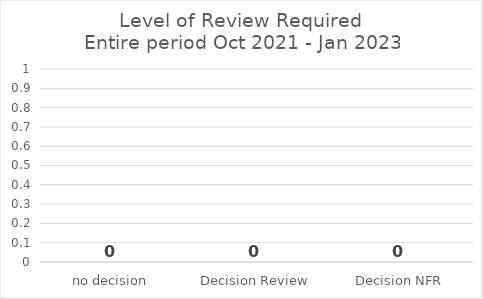
| Category | Series 0 |
|---|---|
| no decision | 0 |
| Decision Review | 0 |
| Decision NFR | 0 |